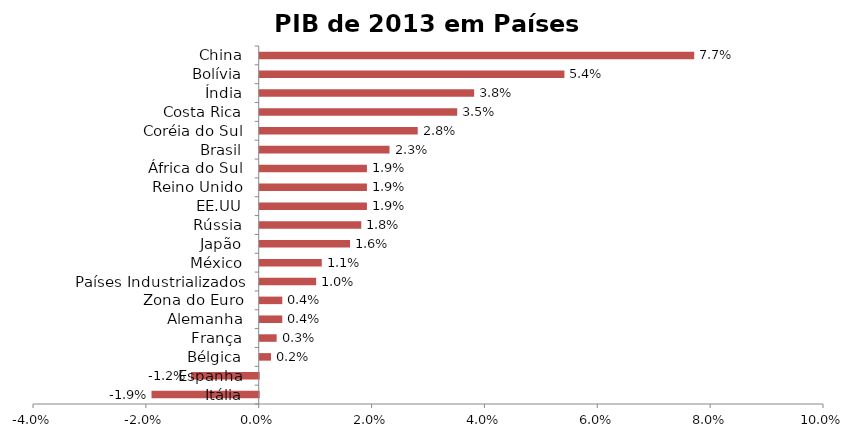
| Category | PIB |
|---|---|
| Itália | -0.019 |
| Espanha | -0.012 |
| Bélgica | 0.002 |
| França | 0.003 |
| Alemanha | 0.004 |
| Zona do Euro | 0.004 |
| Países Industrializados | 0.01 |
| México | 0.011 |
| Japão | 0.016 |
| Rússia | 0.018 |
| EE.UU | 0.019 |
| Reino Unido | 0.019 |
| África do Sul | 0.019 |
| Brasil | 0.023 |
| Coréia do Sul | 0.028 |
| Costa Rica | 0.035 |
| Índia | 0.038 |
| Bolívia | 0.054 |
| China | 0.077 |